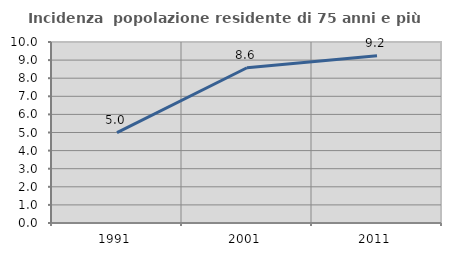
| Category | Incidenza  popolazione residente di 75 anni e più |
|---|---|
| 1991.0 | 4.99 |
| 2001.0 | 8.577 |
| 2011.0 | 9.239 |